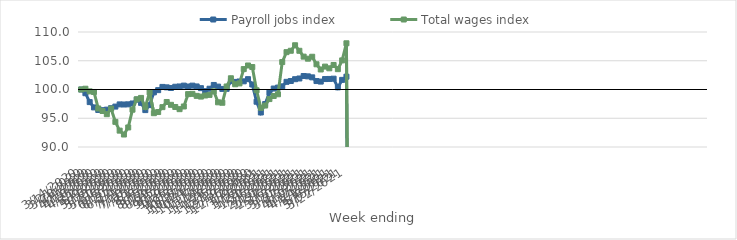
| Category | Payroll jobs index | Total wages index |
|---|---|---|
| 14/03/2020 | 100 | 100 |
| 21/03/2020 | 99.356 | 100.134 |
| 28/03/2020 | 97.808 | 99.674 |
| 04/04/2020 | 96.884 | 99.57 |
| 11/04/2020 | 96.44 | 96.7 |
| 18/04/2020 | 96.403 | 96.261 |
| 25/04/2020 | 96.498 | 95.707 |
| 02/05/2020 | 96.748 | 96.669 |
| 09/05/2020 | 97.028 | 94.372 |
| 16/05/2020 | 97.408 | 92.845 |
| 23/05/2020 | 97.393 | 92.169 |
| 30/05/2020 | 97.419 | 93.398 |
| 06/06/2020 | 97.571 | 96.49 |
| 13/06/2020 | 98.239 | 98.302 |
| 20/06/2020 | 97.674 | 98.536 |
| 27/06/2020 | 96.417 | 96.973 |
| 04/07/2020 | 97.284 | 99.493 |
| 11/07/2020 | 99.503 | 95.878 |
| 18/07/2020 | 99.887 | 96.081 |
| 25/07/2020 | 100.449 | 96.932 |
| 01/08/2020 | 100.375 | 97.826 |
| 08/08/2020 | 100.264 | 97.334 |
| 15/08/2020 | 100.481 | 96.959 |
| 22/08/2020 | 100.527 | 96.58 |
| 29/08/2020 | 100.676 | 97.048 |
| 05/09/2020 | 100.521 | 99.196 |
| 12/09/2020 | 100.672 | 99.24 |
| 19/09/2020 | 100.531 | 98.893 |
| 26/09/2020 | 100.232 | 98.769 |
| 03/10/2020 | 99.707 | 98.954 |
| 10/10/2020 | 100.134 | 99.061 |
| 17/10/2020 | 100.79 | 99.689 |
| 24/10/2020 | 100.503 | 97.77 |
| 31/10/2020 | 100.102 | 97.695 |
| 07/11/2020 | 100.121 | 100.525 |
| 14/11/2020 | 101.454 | 101.954 |
| 21/11/2020 | 101.32 | 100.912 |
| 28/11/2020 | 101.396 | 101.062 |
| 05/12/2020 | 101.424 | 103.55 |
| 12/12/2020 | 101.802 | 104.177 |
| 19/12/2020 | 100.872 | 103.906 |
| 26/12/2020 | 97.873 | 99.864 |
| 02/01/2021 | 96 | 96.816 |
| 09/01/2021 | 97.467 | 97.21 |
| 16/01/2021 | 99.459 | 98.337 |
| 23/01/2021 | 100.166 | 98.868 |
| 30/01/2021 | 100.334 | 99.17 |
| 06/02/2021 | 100.548 | 104.771 |
| 13/02/2021 | 101.333 | 106.495 |
| 20/02/2021 | 101.48 | 106.737 |
| 27/02/2021 | 101.792 | 107.695 |
| 06/03/2021 | 101.918 | 106.733 |
| 13/03/2021 | 102.342 | 105.716 |
| 20/03/2021 | 102.287 | 105.361 |
| 27/03/2021 | 102.112 | 105.695 |
| 03/04/2021 | 101.468 | 104.383 |
| 10/04/2021 | 101.378 | 103.482 |
| 17/04/2021 | 101.818 | 103.982 |
| 24/04/2021 | 101.835 | 103.685 |
| 01/05/2021 | 101.883 | 104.262 |
| 08/05/2021 | 100.37 | 103.536 |
| 15/05/2021 | 101.675 | 105.062 |
| 22/05/2021 | 102.229 | 108.036 |